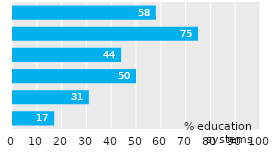
| Category | Institutions |
|---|---|
| ECEC | 58 |
| Primary-upper secondary | 75 |
| Post-secondary, non-tertiary | 44 |
| Tertiary | 50 |
| Adult education | 31 |
| Not known | 17 |